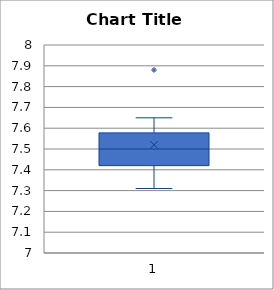
| Category | Series 0 |
|---|---|
| 7.31-7.4 | 2 |
| 7.41-7.5 | 4 |
| 7.51-7.6 | 4 |
| 7.61-7.7 | 1 |